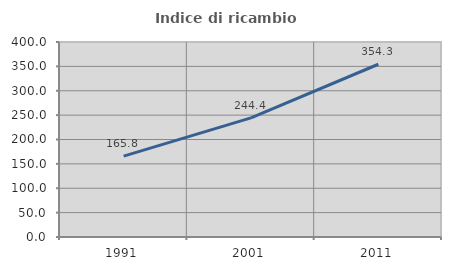
| Category | Indice di ricambio occupazionale  |
|---|---|
| 1991.0 | 165.812 |
| 2001.0 | 244.444 |
| 2011.0 | 354.348 |